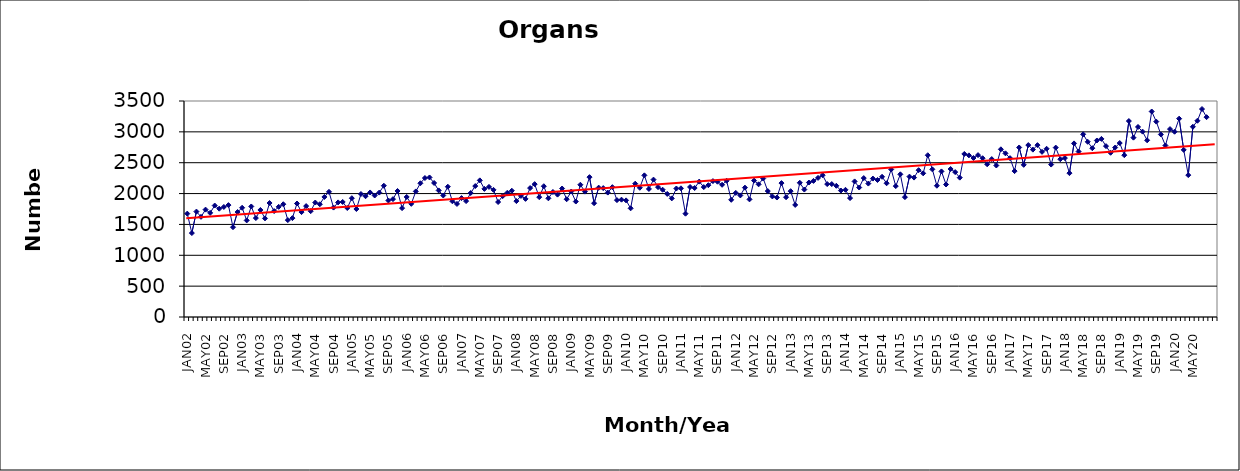
| Category | Series 0 |
|---|---|
| JAN02 | 1675 |
| FEB02 | 1360 |
| MAR02 | 1708 |
| APR02 | 1623 |
| MAY02 | 1740 |
| JUN02 | 1687 |
| JUL02 | 1806 |
| AUG02 | 1755 |
| SEP02 | 1783 |
| OCT02 | 1813 |
| NOV02 | 1455 |
| DEC02 | 1701 |
| JAN03 | 1770 |
| FEB03 | 1565 |
| MAR03 | 1791 |
| APR03 | 1603 |
| MAY03 | 1734 |
| JUN03 | 1598 |
| JUL03 | 1847 |
| AUG03 | 1716 |
| SEP03 | 1785 |
| OCT03 | 1827 |
| NOV03 | 1570 |
| DEC03 | 1602 |
| JAN04 | 1839 |
| FEB04 | 1700 |
| MAR04 | 1797 |
| APR04 | 1715 |
| MAY04 | 1855 |
| JUN04 | 1827 |
| JUL04 | 1945 |
| AUG04 | 2028 |
| SEP04 | 1773 |
| OCT04 | 1857 |
| NOV04 | 1864 |
| DEC04 | 1766 |
| JAN05 | 1925 |
| FEB05 | 1750 |
| MAR05 | 1993 |
| APR05 | 1957 |
| MAY05 | 2018 |
| JUN05 | 1969 |
| JUL05 | 2016 |
| AUG05 | 2127 |
| SEP05 | 1888 |
| OCT05 | 1910 |
| NOV05 | 2042 |
| DEC05 | 1764 |
| JAN06 | 1945 |
| FEB06 | 1834 |
| MAR06 | 2035 |
| APR06 | 2167 |
| MAY06 | 2252 |
| JUN06 | 2261 |
| JUL06 | 2172 |
| AUG06 | 2051 |
| SEP06 | 1969 |
| OCT06 | 2111 |
| NOV06 | 1875 |
| DEC06 | 1832 |
| JAN07 | 1927 |
| FEB07 | 1878 |
| MAR07 | 2009 |
| APR07 | 2122 |
| MAY07 | 2214 |
| JUN07 | 2076 |
| JUL07 | 2108 |
| AUG07 | 2060 |
| SEP07 | 1863 |
| OCT07 | 1959 |
| NOV07 | 2012 |
| DEC07 | 2046 |
| JAN08 | 1878 |
| FEB08 | 1962 |
| MAR08 | 1914 |
| APR08 | 2089 |
| MAY08 | 2153 |
| JUN08 | 1942 |
| JUL08 | 2119 |
| AUG08 | 1923 |
| SEP08 | 2026 |
| OCT08 | 1983 |
| NOV08 | 2082 |
| DEC08 | 1908 |
| JAN09 | 2033 |
| FEB09 | 1871 |
| MAR09 | 2143 |
| APR09 | 2032 |
| MAY09 | 2266 |
| JUN09 | 1844 |
| JUL09 | 2096 |
| AUG09 | 2089 |
| SEP09 | 2016 |
| OCT09 | 2104 |
| NOV09 | 1894 |
| DEC09 | 1901 |
| JAN10 | 1890 |
| FEB10 | 1761 |
| MAR10 | 2160 |
| APR10 | 2094 |
| MAY10 | 2295 |
| JUN10 | 2075 |
| JUL10 | 2226 |
| AUG10 | 2104 |
| SEP10 | 2062 |
| OCT10 | 1994 |
| NOV10 | 1922 |
| DEC10 | 2082 |
| JAN11 | 2085 |
| FEB11 | 1674 |
| MAR11 | 2106 |
| APR11 | 2090 |
| MAY11 | 2194 |
| JUN11 | 2105 |
| JUL11 | 2136 |
| AUG11 | 2202 |
| SEP11 | 2192 |
| OCT11 | 2142 |
| NOV11 | 2207 |
| DEC11 | 1899 |
| JAN12 | 2011 |
| FEB12 | 1970 |
| MAR12 | 2096 |
| APR12 | 1906 |
| MAY12 | 2210 |
| JUN12 | 2150 |
| JUL12 | 2244 |
| AUG12 | 2041 |
| SEP12 | 1954 |
| OCT12 | 1936 |
| NOV12 | 2170 |
| DEC12 | 1941 |
| JAN13 | 2039 |
| FEB13 | 1816 |
| MAR13 | 2175 |
| APR13 | 2065 |
| MAY13 | 2179 |
| JUN13 | 2205 |
| JUL13 | 2254 |
| AUG13 | 2297 |
| SEP13 | 2154 |
| OCT13 | 2154 |
| NOV13 | 2126 |
| DEC13 | 2049 |
| JAN14 | 2061 |
| FEB14 | 1927 |
| MAR14 | 2197 |
| APR14 | 2098 |
| MAY14 | 2251 |
| JUN14 | 2162 |
| JUL14 | 2243 |
| AUG14 | 2220 |
| SEP14 | 2272 |
| OCT14 | 2167 |
| NOV14 | 2391 |
| DEC14 | 2121 |
| JAN15 | 2312 |
| FEB15 | 1942 |
| MAR15 | 2275 |
| APR15 | 2259 |
| MAY15 | 2379 |
| JUN15 | 2328 |
| JUL15 | 2621 |
| AUG15 | 2393 |
| SEP15 | 2127 |
| OCT15 | 2359 |
| NOV15 | 2147 |
| DEC15 | 2398 |
| JAN16 | 2348 |
| FEB16 | 2258 |
| MAR16 | 2642 |
| APR16 | 2619 |
| MAY16 | 2576 |
| JUN16 | 2623 |
| JUL16 | 2573 |
| AUG16 | 2475 |
| SEP16 | 2559 |
| OCT16 | 2455 |
| NOV16 | 2717 |
| DEC16 | 2652 |
| JAN17 | 2574 |
| FEB17 | 2364 |
| MAR17 | 2747 |
| APR17 | 2466 |
| MAY17 | 2786 |
| JUN17 | 2712 |
| JUL17 | 2785 |
| AUG17 | 2676 |
| SEP17 | 2726 |
| OCT17 | 2470 |
| NOV17 | 2745 |
| DEC17 | 2557 |
| JAN18 | 2575 |
| FEB18 | 2331 |
| MAR18 | 2813 |
| APR18 | 2681 |
| MAY18 | 2960 |
| JUN18 | 2839 |
| JUL18 | 2735 |
| AUG18 | 2860 |
| SEP18 | 2886 |
| OCT18 | 2769 |
| NOV18 | 2661 |
| DEC18 | 2746 |
| JAN19 | 2819 |
| FEB19 | 2622 |
| MAR19 | 3175 |
| APR19 | 2906 |
| MAY19 | 3079 |
| JUN19 | 3004 |
| JUL19 | 2863 |
| AUG19 | 3330 |
| SEP19 | 3166 |
| OCT19 | 2958 |
| NOV19 | 2779 |
| DEC19 | 3045 |
| JAN20 | 3002 |
| FEB20 | 3214 |
| MAR20 | 2708 |
| APR20 | 2299 |
| MAY20 | 3082 |
| JUN20 | 3180 |
| JUL20 | 3370 |
| AUG20 | 3238 |